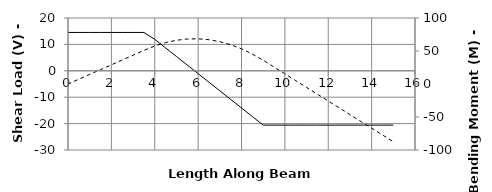
| Category | V |
|---|---|
| 0.0 | 14.526 |
| 0.0 | 14.526 |
| 0.5 | 14.526 |
| 1.0 | 14.526 |
| 1.5 | 14.526 |
| 2.0 | 14.526 |
| 2.5 | 14.526 |
| 3.0 | 14.526 |
| 3.5 | 14.526 |
| 4.0 | 11.926 |
| 4.5 | 8.676 |
| 5.0 | 5.426 |
| 5.5 | 2.176 |
| 6.0 | -1.074 |
| 6.0 | -1.074 |
| 6.5 | -4.324 |
| 7.0 | -7.574 |
| 7.5 | -10.824 |
| 8.0 | -14.074 |
| 8.5 | -17.324 |
| 9.0 | -20.574 |
| 9.5 | -20.574 |
| 10.0 | -20.574 |
| 10.5 | -20.574 |
| 11.0 | -20.574 |
| 11.4 | -20.574 |
| 11.5 | -20.574 |
| 12.0 | -20.574 |
| 12.5 | -20.574 |
| 13.0 | -20.574 |
| 13.5 | -20.574 |
| 14.0 | -20.574 |
| 14.5 | -20.574 |
| 15.0 | -20.574 |
| 15.0 | -20.574 |